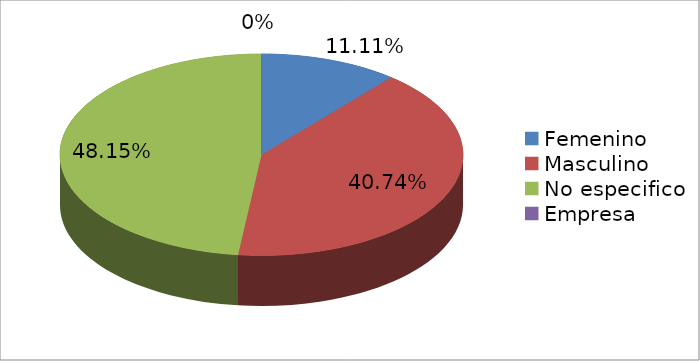
| Category | Series 0 |
|---|---|
| Femenino | 3 |
| Masculino | 11 |
| No especifico | 13 |
| Empresa | 0 |